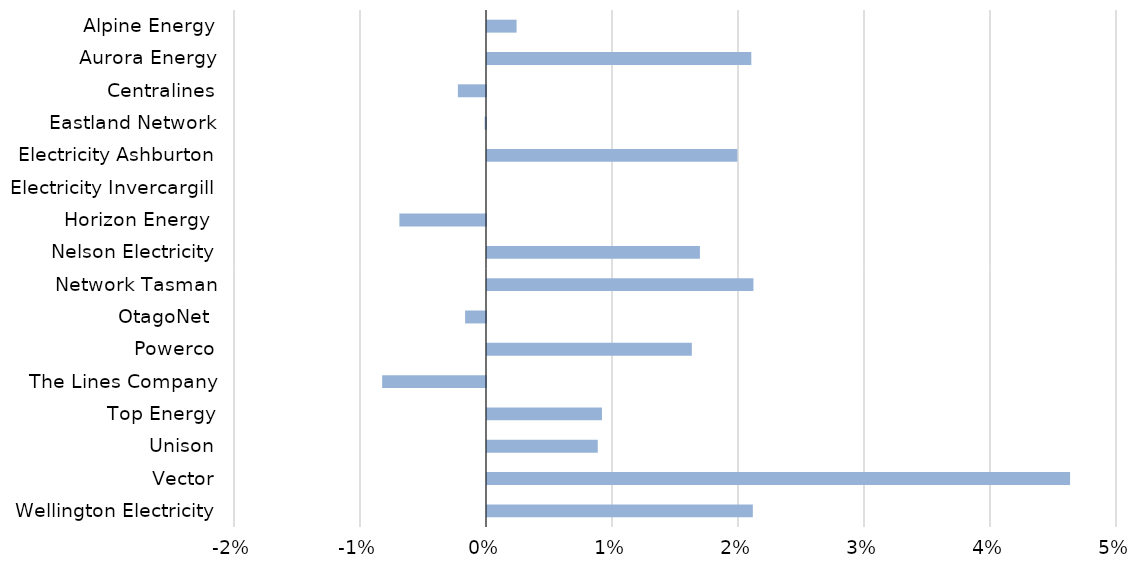
| Category | Cumulative growth 2012/13 to 2014/15 |
|---|---|
| Alpine Energy | 0.002 |
| Aurora Energy | 0.021 |
| Centralines | -0.002 |
| Eastland Network | 0 |
| Electricity Ashburton | 0.02 |
| Electricity Invercargill | 0 |
| Horizon Energy  | -0.007 |
| Nelson Electricity | 0.017 |
| Network Tasman | 0.021 |
| OtagoNet  | -0.002 |
| Powerco | 0.016 |
| The Lines Company | -0.008 |
| Top Energy | 0.009 |
| Unison | 0.009 |
| Vector | 0.046 |
| Wellington Electricity | 0.021 |